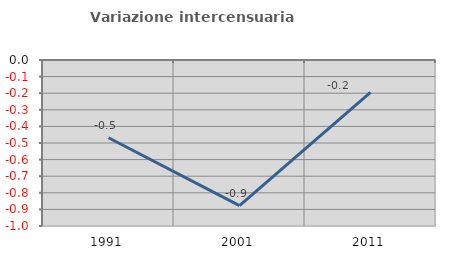
| Category | Variazione intercensuaria annua |
|---|---|
| 1991.0 | -0.468 |
| 2001.0 | -0.877 |
| 2011.0 | -0.196 |